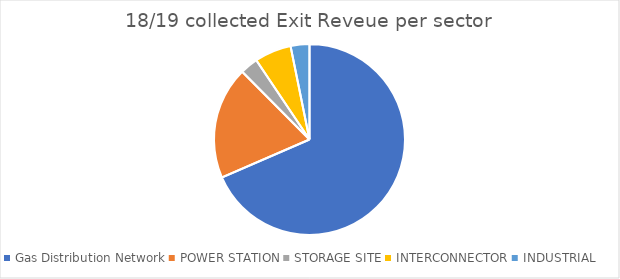
| Category | Series 0 | Series 1 |
|---|---|---|
| Gas Distribution Network | 225175582.446 | 225175582.446 |
| POWER STATION | 62676135.991 | 62676135.991 |
| STORAGE SITE | 10004819.695 | 10004819.695 |
| INTERCONNECTOR | 20441285.301 | 20441285.301 |
| INDUSTRIAL | 10480600.698 | 10480600.698 |